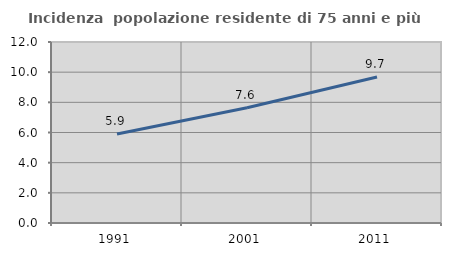
| Category | Incidenza  popolazione residente di 75 anni e più |
|---|---|
| 1991.0 | 5.902 |
| 2001.0 | 7.646 |
| 2011.0 | 9.675 |